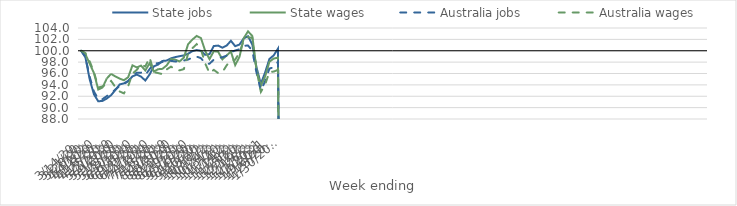
| Category | State jobs | State wages | Australia jobs | Australia wages |
|---|---|---|---|---|
| 14/03/2020 | 100 | 100 | 100 | 100 |
| 21/03/2020 | 98.832 | 99.392 | 98.956 | 99.595 |
| 28/03/2020 | 94.969 | 97.725 | 95.413 | 98.12 |
| 04/04/2020 | 92.325 | 96.068 | 92.814 | 96.244 |
| 11/04/2020 | 91.109 | 93.181 | 91.522 | 93.536 |
| 18/04/2020 | 91.185 | 93.533 | 91.5 | 93.735 |
| 25/04/2020 | 91.601 | 95.133 | 92.025 | 94.14 |
| 02/05/2020 | 92.192 | 95.933 | 92.519 | 94.693 |
| 09/05/2020 | 93.086 | 95.478 | 93.198 | 93.616 |
| 16/05/2020 | 94.074 | 95.103 | 93.788 | 92.845 |
| 23/05/2020 | 94.261 | 94.812 | 94.146 | 92.504 |
| 30/05/2020 | 94.69 | 95.358 | 94.65 | 93.808 |
| 06/06/2020 | 95.502 | 97.44 | 95.634 | 95.987 |
| 13/06/2020 | 95.808 | 97.067 | 96.135 | 96.641 |
| 20/06/2020 | 95.45 | 97.382 | 96.154 | 97.544 |
| 27/06/2020 | 94.763 | 96.539 | 95.728 | 97.236 |
| 04/07/2020 | 95.831 | 97.801 | 96.767 | 98.815 |
| 11/07/2020 | 97.263 | 96.353 | 97.729 | 96.243 |
| 18/07/2020 | 97.574 | 96.755 | 97.82 | 96.079 |
| 25/07/2020 | 98.212 | 96.819 | 98.028 | 95.887 |
| 01/08/2020 | 98.274 | 97.432 | 98.238 | 96.723 |
| 08/08/2020 | 98.668 | 98.54 | 98.223 | 97.204 |
| 15/08/2020 | 98.884 | 98.438 | 98.112 | 96.712 |
| 22/08/2020 | 99.041 | 98.117 | 98.158 | 96.554 |
| 29/08/2020 | 99.183 | 98.791 | 98.287 | 96.77 |
| 05/09/2020 | 99.476 | 101.157 | 98.443 | 99.477 |
| 12/09/2020 | 99.931 | 101.964 | 98.829 | 100.444 |
| 19/09/2020 | 100.126 | 102.606 | 98.97 | 101.162 |
| 26/09/2020 | 99.983 | 102.235 | 98.7 | 100.248 |
| 03/10/2020 | 99.282 | 99.949 | 97.765 | 97.757 |
| 10/10/2020 | 99.406 | 98.528 | 97.711 | 96.071 |
| 17/10/2020 | 100.827 | 99.911 | 98.435 | 96.645 |
| 24/10/2020 | 100.908 | 99.848 | 98.68 | 96.08 |
| 31/10/2020 | 100.542 | 98.488 | 98.863 | 96.206 |
| 07/11/2020 | 100.905 | 99.174 | 99.129 | 97.432 |
| 14/11/2020 | 101.749 | 99.855 | 99.776 | 98.33 |
| 21/11/2020 | 100.805 | 97.477 | 100.039 | 98.416 |
| 28/11/2020 | 101.087 | 98.906 | 100.264 | 99.694 |
| 05/12/2020 | 102.171 | 102.211 | 100.878 | 101.784 |
| 12/12/2020 | 102.553 | 103.409 | 100.916 | 102.402 |
| 19/12/2020 | 101.104 | 102.596 | 100.035 | 102.249 |
| 26/12/2020 | 97.018 | 96.55 | 96.089 | 96.528 |
| 02/01/2021 | 94.172 | 93.84 | 92.998 | 92.765 |
| 09/01/2021 | 96.193 | 95.464 | 94.651 | 94.062 |
| 16/01/2021 | 98.554 | 98.067 | 96.853 | 96.284 |
| 23/01/2021 | 99.18 | 98.626 | 97.109 | 96.336 |
| 30/01/2021 | 100.373 | 98.789 | 98.068 | 96.635 |